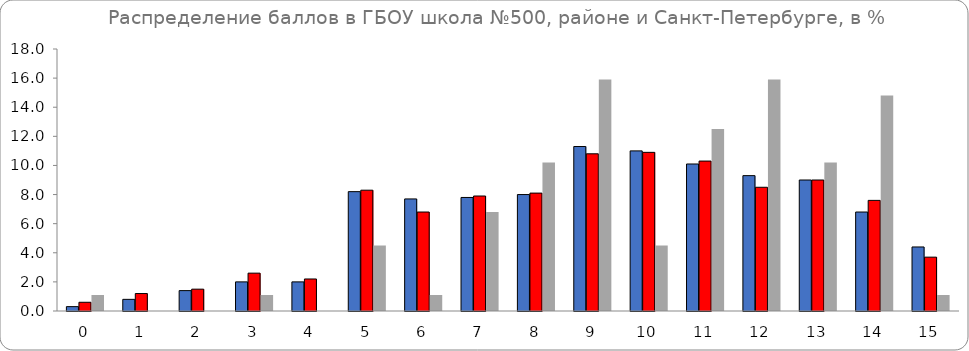
| Category | Series 0 | Series 1 | Series 2 |
|---|---|---|---|
| 0.0 | 0.3 | 0.6 | 1.1 |
| 1.0 | 0.8 | 1.2 | 0 |
| 2.0 | 1.4 | 1.5 | 0 |
| 3.0 | 2 | 2.6 | 1.1 |
| 4.0 | 2 | 2.2 | 0 |
| 5.0 | 8.2 | 8.3 | 4.5 |
| 6.0 | 7.7 | 6.8 | 1.1 |
| 7.0 | 7.8 | 7.9 | 6.8 |
| 8.0 | 8 | 8.1 | 10.2 |
| 9.0 | 11.3 | 10.8 | 15.9 |
| 10.0 | 11 | 10.9 | 4.5 |
| 11.0 | 10.1 | 10.3 | 12.5 |
| 12.0 | 9.3 | 8.5 | 15.9 |
| 13.0 | 9 | 9 | 10.2 |
| 14.0 | 6.8 | 7.6 | 14.8 |
| 15.0 | 4.4 | 3.7 | 1.1 |